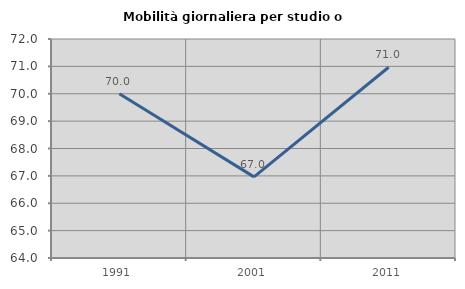
| Category | Mobilità giornaliera per studio o lavoro |
|---|---|
| 1991.0 | 70 |
| 2001.0 | 66.964 |
| 2011.0 | 70.968 |